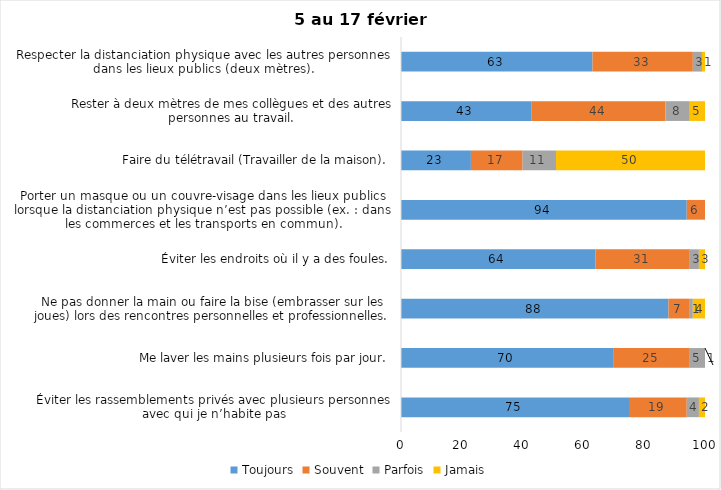
| Category | Toujours | Souvent | Parfois | Jamais |
|---|---|---|---|---|
| Éviter les rassemblements privés avec plusieurs personnes avec qui je n’habite pas | 75 | 19 | 4 | 2 |
| Me laver les mains plusieurs fois par jour. | 70 | 25 | 5 | 1 |
| Ne pas donner la main ou faire la bise (embrasser sur les joues) lors des rencontres personnelles et professionnelles. | 88 | 7 | 1 | 4 |
| Éviter les endroits où il y a des foules. | 64 | 31 | 3 | 3 |
| Porter un masque ou un couvre-visage dans les lieux publics lorsque la distanciation physique n’est pas possible (ex. : dans les commerces et les transports en commun). | 94 | 6 | 0 | 0 |
| Faire du télétravail (Travailler de la maison). | 23 | 17 | 11 | 50 |
| Rester à deux mètres de mes collègues et des autres personnes au travail. | 43 | 44 | 8 | 5 |
| Respecter la distanciation physique avec les autres personnes dans les lieux publics (deux mètres). | 63 | 33 | 3 | 1 |